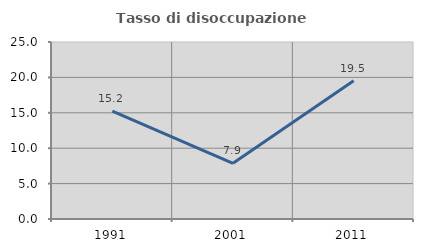
| Category | Tasso di disoccupazione giovanile  |
|---|---|
| 1991.0 | 15.235 |
| 2001.0 | 7.865 |
| 2011.0 | 19.54 |